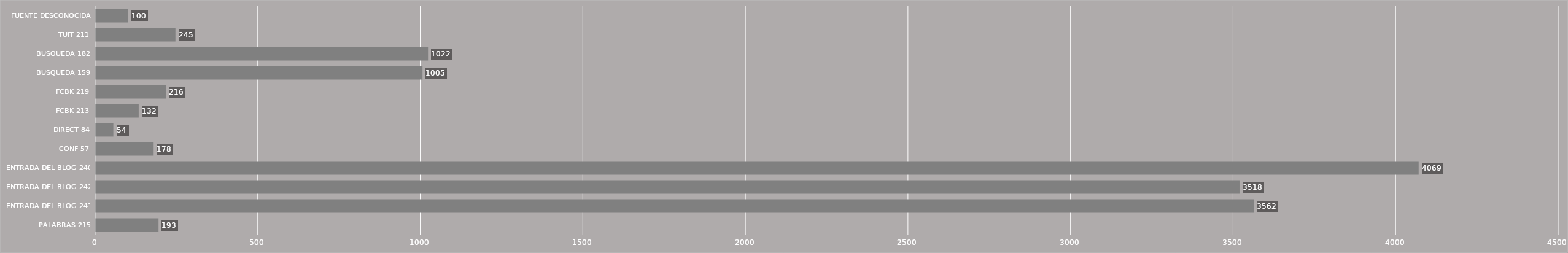
| Category | Series 0 |
|---|---|
| Palabras 215 | 193 |
| ENTRADA DEL BLOG 241 | 3562 |
| ENTRADA DEL BLOG 242 | 3518 |
| ENTRADA DEL BLOG 240 | 4069 |
| CONF 57 | 178 |
| DIRECT 84 | 54 |
| FCBK 213 | 132 |
| FCBK 219 | 216 |
| BÚSQUEDA 159 | 1005 |
| BÚSQUEDA 182 | 1022 |
| TUIT 211 | 245 |
| FUENTE DESCONOCIDA | 100 |